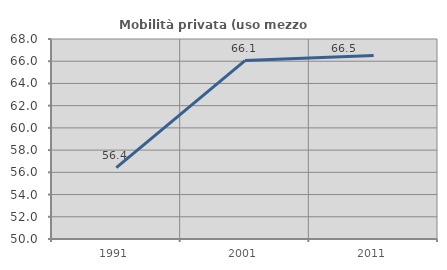
| Category | Mobilità privata (uso mezzo privato) |
|---|---|
| 1991.0 | 56.426 |
| 2001.0 | 66.061 |
| 2011.0 | 66.515 |